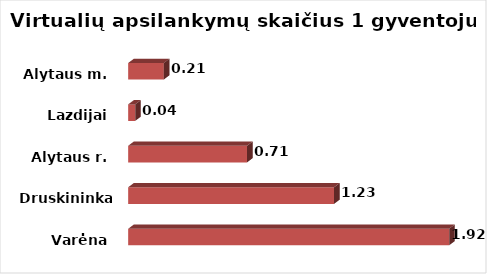
| Category | Series 0 |
|---|---|
| Varėna | 1.924 |
| Druskininkai  | 1.234 |
| Alytaus r. | 0.712 |
| Lazdijai | 0.042 |
| Alytaus m. | 0.214 |